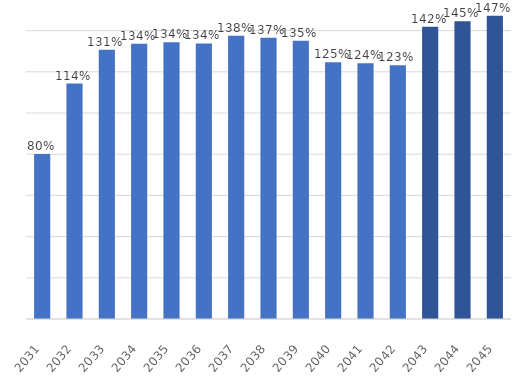
| Category | Percentage Clean Energy |
|---|---|
| 2031.0 | 0.801 |
| 2032.0 | 1.143 |
| 2033.0 | 1.307 |
| 2034.0 | 1.336 |
| 2035.0 | 1.343 |
| 2036.0 | 1.338 |
| 2037.0 | 1.375 |
| 2038.0 | 1.365 |
| 2039.0 | 1.351 |
| 2040.0 | 1.246 |
| 2041.0 | 1.241 |
| 2042.0 | 1.232 |
| 2043.0 | 1.419 |
| 2044.0 | 1.446 |
| 2045.0 | 1.472 |